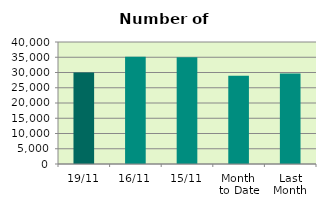
| Category | Series 0 |
|---|---|
| 19/11 | 30014 |
| 16/11 | 35140 |
| 15/11 | 34960 |
| Month 
to Date | 28917.538 |
| Last
Month | 29672.087 |